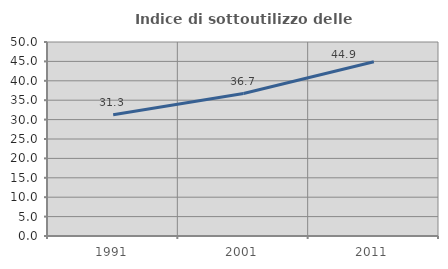
| Category | Indice di sottoutilizzo delle abitazioni  |
|---|---|
| 1991.0 | 31.258 |
| 2001.0 | 36.713 |
| 2011.0 | 44.901 |